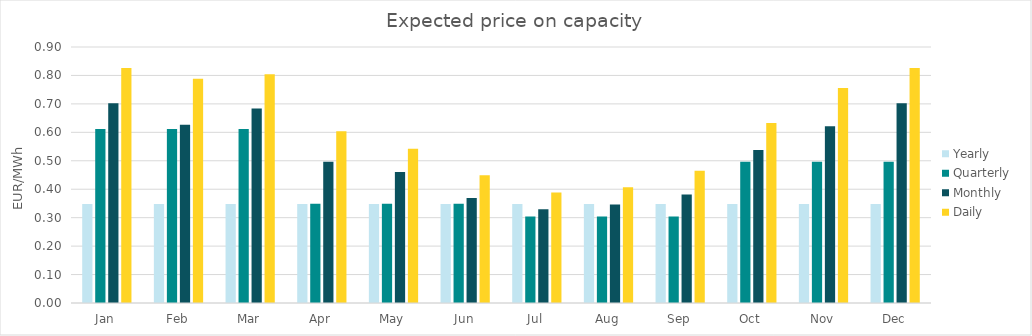
| Category | Yearly | Quarterly | Monthly | Daily |
|---|---|---|---|---|
| Jan | 0.348 | 0.612 | 0.702 | 0.827 |
| Feb | 0.348 | 0.612 | 0.627 | 0.789 |
| Mar | 0.348 | 0.612 | 0.683 | 0.805 |
| Apr | 0.348 | 0.349 | 0.496 | 0.604 |
| May | 0.348 | 0.349 | 0.461 | 0.542 |
| Jun | 0.348 | 0.349 | 0.369 | 0.449 |
| Jul | 0.348 | 0.304 | 0.33 | 0.388 |
| Aug | 0.348 | 0.304 | 0.346 | 0.407 |
| Sep | 0.348 | 0.304 | 0.382 | 0.465 |
| Oct | 0.348 | 0.496 | 0.538 | 0.633 |
| Nov | 0.348 | 0.496 | 0.621 | 0.756 |
| Dec | 0.348 | 0.496 | 0.702 | 0.827 |